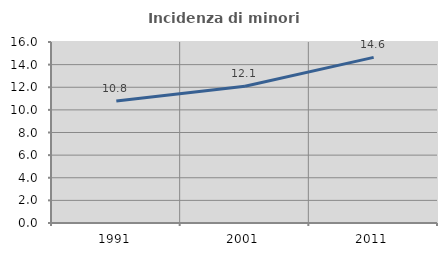
| Category | Incidenza di minori stranieri |
|---|---|
| 1991.0 | 10.78 |
| 2001.0 | 12.089 |
| 2011.0 | 14.638 |